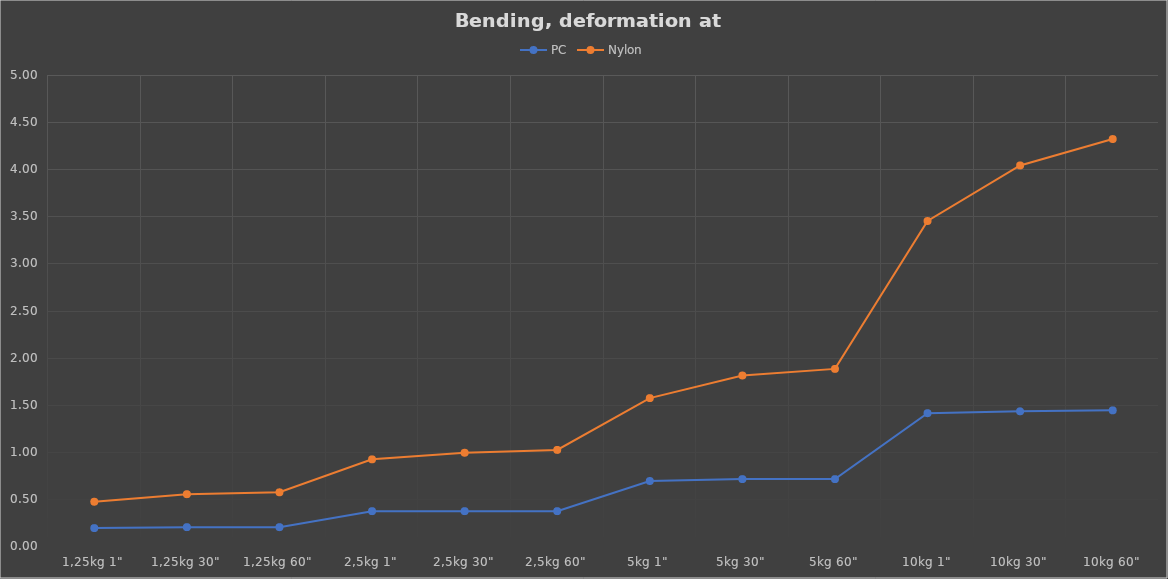
| Category | PC | Nylon |
|---|---|---|
| 1,25kg 1" | 0.19 | 0.47 |
| 1,25kg 30" | 0.2 | 0.55 |
| 1,25kg 60" | 0.2 | 0.57 |
| 2,5kg 1" | 0.37 | 0.92 |
| 2,5kg 30" | 0.37 | 0.99 |
| 2,5kg 60" | 0.37 | 1.02 |
| 5kg 1" | 0.69 | 1.57 |
| 5kg 30" | 0.71 | 1.81 |
| 5kg 60" | 0.71 | 1.88 |
| 10kg 1" | 1.41 | 3.45 |
| 10kg 30" | 1.43 | 4.04 |
| 10kg 60" | 1.44 | 4.32 |